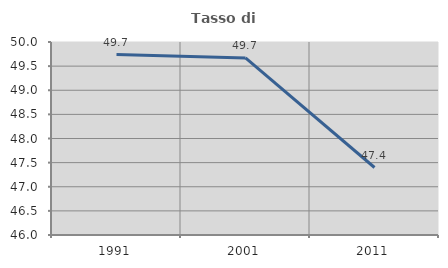
| Category | Tasso di occupazione   |
|---|---|
| 1991.0 | 49.74 |
| 2001.0 | 49.67 |
| 2011.0 | 47.399 |